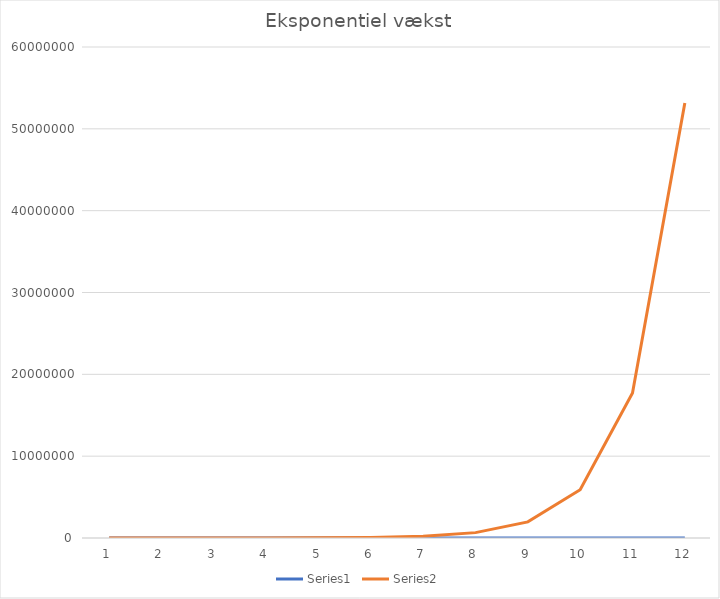
| Category | Series 0 | Series 1 |
|---|---|---|
| 0 | 1 | 300 |
| 1 | 2 | 900 |
| 2 | 3 | 2700 |
| 3 | 4 | 8100 |
| 4 | 5 | 24300 |
| 5 | 6 | 72900 |
| 6 | 7 | 218700 |
| 7 | 8 | 656100 |
| 8 | 9 | 1968300 |
| 9 | 10 | 5904900 |
| 10 | 11 | 17714700 |
| 11 | 12 | 53144100 |